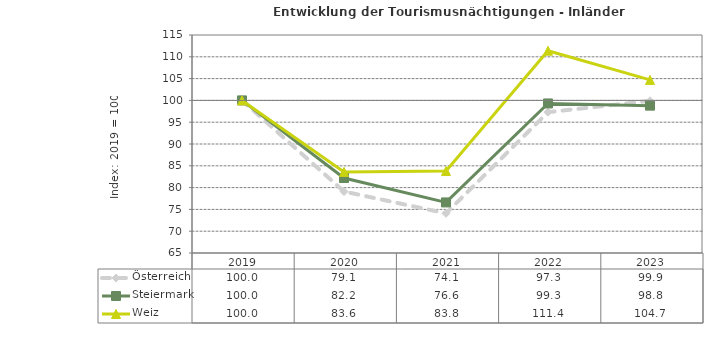
| Category | Österreich | Steiermark | Weiz |
|---|---|---|---|
| 2023.0 | 99.9 | 98.8 | 104.7 |
| 2022.0 | 97.3 | 99.3 | 111.4 |
| 2021.0 | 74.1 | 76.6 | 83.8 |
| 2020.0 | 79.1 | 82.2 | 83.6 |
| 2019.0 | 100 | 100 | 100 |